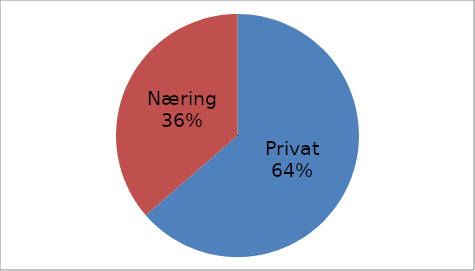
| Category | Series 0 |
|---|---|
| Privat | 41731449 |
| Næring | 23858538 |